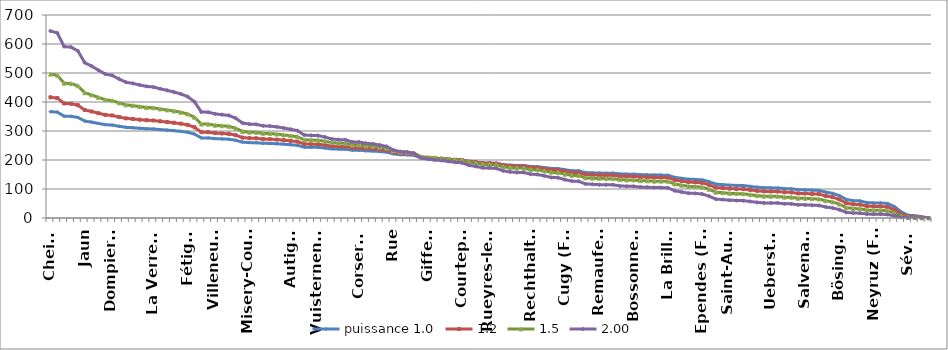
| Category | puissance 1.0 | 1.2 | 1.5 |  2.00  |
|---|---|---|---|---|
| Cheiry | 366.836 | 416.144 | 495.994 | 644.749 |
| Le Châtelard | 364.952 | 413.581 | 492.178 | 638.144 |
| Massonnens | 351.251 | 395.02 | 464.724 | 591.13 |
| Zumholz | 350.652 | 394.211 | 463.535 | 589.114 |
| Le Flon | 346.799 | 389.018 | 455.916 | 576.238 |
| Jaun | 334.382 | 372.365 | 431.652 | 535.715 |
| Mézières (FR) | 330.615 | 367.336 | 424.377 | 523.711 |
| Nuvilly | 326.076 | 361.294 | 415.669 | 509.431 |
| St. Silvester | 321.88 | 355.722 | 407.671 | 496.405 |
| Oberschrot | 320.339 | 353.679 | 404.747 | 491.663 |
| Dompierre (FR) | 316.315 | 348.354 | 397.143 | 479.386 |
| Prévondavaux | 312.633 | 343.493 | 390.229 | 468.291 |
| Autafond | 311.262 | 341.688 | 387.667 | 464.195 |
| Billens-Hennens | 309.379 | 339.208 | 384.153 | 458.593 |
| Murist | 307.752 | 337.068 | 381.126 | 453.783 |
| La Verrerie | 307.067 | 336.168 | 379.854 | 451.765 |
| Vernay | 304.926 | 333.358 | 375.889 | 445.488 |
| Surpierre | 303.128 | 331 | 372.569 | 440.249 |
| Villorsonnens | 301.073 | 328.309 | 368.787 | 434.3 |
| Villarsel-sur-Marly | 298.846 | 325.398 | 364.704 | 427.9 |
| Fétigny | 295.592 | 321.151 | 358.763 | 418.633 |
| Châtonnaye | 289.256 | 312.907 | 347.289 | 400.877 |
| Montagny (FR) | 276.154 | 295.978 | 323.964 | 365.385 |
| Haut-Intyamon | 275.983 | 295.758 | 323.662 | 364.932 |
| Brünisried | 273.757 | 292.897 | 319.754 | 359.068 |
| Villeneuve (FR) | 272.729 | 291.579 | 317.955 | 356.378 |
| Ponthaux | 271.702 | 290.261 | 316.16 | 353.697 |
| Vuisternens-devant-Romont | 268.02 | 285.547 | 309.755 | 344.176 |
| Chénens | 261.512 | 277.247 | 298.542 | 327.665 |
| Plasselb | 259.971 | 275.287 | 295.906 | 323.814 |
| Misery-Courtion | 259.542 | 274.743 | 295.176 | 322.748 |
| Vallon | 257.573 | 272.244 | 291.822 | 317.868 |
| Treyvaux | 257.145 | 271.701 | 291.095 | 316.813 |
| Saint-Martin (FR) | 256.117 | 270.398 | 289.352 | 314.286 |
| Heitenried | 254.49 | 268.338 | 286.599 | 310.305 |
| Autigny | 252.692 | 266.065 | 283.567 | 305.936 |
| Ménières | 250.723 | 263.578 | 280.258 | 301.185 |
| La Folliaz | 244.386 | 255.605 | 269.701 | 286.154 |
| Bas-Intyamon | 243.787 | 254.853 | 268.71 | 284.752 |
| Lurtigen | 243.53 | 254.53 | 268.285 | 284.152 |
| Vuisternens-en-Ogoz | 241.389 | 251.848 | 264.755 | 279.178 |
| Ecublens (FR) | 238.478 | 248.207 | 259.98 | 272.485 |
| Les Montets | 237.536 | 247.031 | 258.441 | 270.336 |
| Bussy (FR) | 237.193 | 246.604 | 257.882 | 269.557 |
| Morens (FR) | 233.854 | 242.443 | 252.455 | 262.02 |
| Corserey | 233.854 | 242.443 | 252.455 | 262.02 |
| Lully (FR) | 231.798 | 239.889 | 249.135 | 257.435 |
| Le Glèbe | 231.028 | 238.932 | 247.893 | 255.726 |
| Botterens | 229.144 | 236.596 | 244.867 | 251.573 |
| Corpataux-Magnedens | 227.003 | 233.946 | 241.444 | 246.894 |
| Rue | 221.18 | 226.764 | 232.214 | 234.391 |
| St. Ursen | 218.44 | 223.397 | 227.912 | 228.619 |
| Torny | 217.927 | 222.766 | 227.109 | 227.545 |
| Russy | 215.786 | 220.143 | 223.77 | 223.097 |
| Semsales | 207.651 | 210.222 | 211.237 | 206.593 |
| Giffers | 205.938 | 208.143 | 208.629 | 203.199 |
| Vaulruz | 204.311 | 206.172 | 206.161 | 200.001 |
| Grangettes | 203.455 | 205.135 | 204.867 | 198.328 |
| Hauteville | 201.828 | 203.168 | 202.414 | 195.169 |
| Senèdes | 200.201 | 201.204 | 199.972 | 192.035 |
| Courtepin | 199.345 | 200.172 | 198.69 | 190.396 |
| St. Antoni | 194.721 | 194.613 | 191.817 | 181.666 |
| Noréaz | 192.752 | 192.254 | 188.914 | 178.009 |
| Broc | 190.011 | 188.979 | 184.9 | 172.984 |
| Alterswil | 189.669 | 188.57 | 184.401 | 172.361 |
| Rueyres-les-Prés | 188.813 | 187.549 | 183.153 | 170.808 |
| Vuadens | 184.189 | 182.051 | 176.467 | 162.545 |
| Gempenach | 182.133 | 179.616 | 173.521 | 158.938 |
| Le Mouret | 181.106 | 178.401 | 172.055 | 157.149 |
| Ursy | 181.02 | 178.3 | 171.933 | 157.001 |
| Rechthalten | 177.595 | 174.259 | 167.076 | 151.116 |
| Sâles | 176.91 | 173.452 | 166.111 | 149.952 |
| Farvagny | 174.17 | 170.234 | 162.266 | 145.343 |
| Plaffeien | 170.83 | 166.324 | 157.622 | 139.823 |
| Vuissens | 170.317 | 165.724 | 156.911 | 138.983 |
| Cugy (FR) | 166.206 | 160.937 | 151.266 | 132.356 |
| Villarepos | 162.953 | 157.163 | 146.845 | 127.224 |
| Le Pâquier (FR) | 162.61 | 156.767 | 146.383 | 126.69 |
| Grandvillard | 156.53 | 149.76 | 138.25 | 117.394 |
| Belfaux | 155.845 | 148.974 | 137.344 | 116.368 |
| Remaufens | 154.818 | 147.796 | 135.988 | 114.839 |
| Corbières | 154.646 | 147.6 | 135.762 | 114.585 |
| Gurmels | 154.646 | 147.6 | 135.762 | 114.585 |
| Pont-la-Ville | 151.906 | 144.467 | 132.17 | 110.56 |
| Cottens (FR) | 151.221 | 143.686 | 131.277 | 109.565 |
| Bossonnens | 150.964 | 143.393 | 130.942 | 109.193 |
| Jeuss | 149.166 | 141.345 | 128.61 | 106.608 |
| Montet (Glâne) | 148.824 | 140.956 | 128.167 | 106.119 |
| Grolley | 147.967 | 139.983 | 127.063 | 104.901 |
| Wallenried | 147.882 | 139.886 | 126.952 | 104.78 |
| La Brillaz | 147.454 | 139.4 | 126.401 | 104.174 |
| Ulmiz | 140.09 | 131.088 | 117.051 | 94.028 |
| Galmiz | 136.75 | 127.347 | 112.891 | 89.599 |
| Romont (FR) | 133.753 | 124.006 | 109.2 | 85.714 |
| Prez-vers-Noréaz | 133.068 | 123.244 | 108.362 | 84.839 |
| Ependes (FR) | 131.355 | 121.343 | 106.277 | 82.669 |
| Courlevon | 125.276 | 114.635 | 98.985 | 75.194 |
| Gletterens | 116.541 | 105.112 | 88.816 | 65.074 |
| Villaz-Saint-Pierre | 115.171 | 103.631 | 87.254 | 63.553 |
| Hauterive (FR) | 113.116 | 101.416 | 84.929 | 61.305 |
| Saint-Aubin (FR) | 112.346 | 100.588 | 84.063 | 60.473 |
| Léchelles | 111.746 | 99.944 | 83.391 | 59.829 |
| Pont-en-Ogoz | 109.006 | 97.01 | 80.342 | 56.931 |
| Marsens | 106.095 | 93.91 | 77.145 | 53.93 |
| Gruyères | 104.211 | 91.912 | 75.1 | 52.032 |
| Ueberstorf | 103.868 | 91.55 | 74.73 | 51.691 |
| La Sonnaz | 103.783 | 91.459 | 74.637 | 51.606 |
| Barberêche | 101.299 | 88.839 | 71.975 | 49.166 |
| Echarlens | 100.786 | 88.299 | 71.428 | 48.668 |
| Granges (Veveyse) | 97.361 | 84.71 | 67.818 | 45.416 |
| Salvenach | 97.275 | 84.621 | 67.728 | 45.337 |
| Tentlingen | 95.99 | 83.282 | 66.391 | 44.147 |
| Chapelle (Glâne) | 95.134 | 82.391 | 65.505 | 43.363 |
| Wünnewil-Flamatt | 89.226 | 76.29 | 59.498 | 38.144 |
| Arconciel | 85.03 | 72.005 | 55.351 | 34.641 |
| Bösingen | 77.323 | 64.247 | 47.999 | 28.646 |
| Attalens | 63.879 | 51.087 | 36.042 | 19.551 |
| Kerzers | 59.941 | 47.331 | 32.76 | 17.214 |
| Delley-Portalban | 58.827 | 46.278 | 31.852 | 16.581 |
| Morlon | 53.261 | 41.075 | 27.44 | 13.592 |
| Neyruz (FR) | 52.063 | 39.968 | 26.519 | 12.987 |
| Riaz | 51.977 | 39.889 | 26.454 | 12.944 |
| Châbles | 50.008 | 38.082 | 24.964 | 11.982 |
| La Roche | 39.646 | 28.822 | 17.623 | 7.531 |
| Châtillon (FR) | 21.322 | 13.692 | 6.95 | 2.178 |
| Sévaz | 9.505 | 5.193 | 2.069 | 0.433 |
| Marly | 7.964 | 4.2 | 1.586 | 0.304 |
| Courgevaux | 4.11 | 1.899 | 0.588 | 0.081 |
| Val-de-Charmey | 0.343 | 0.096 | 0.014 | 0.001 |